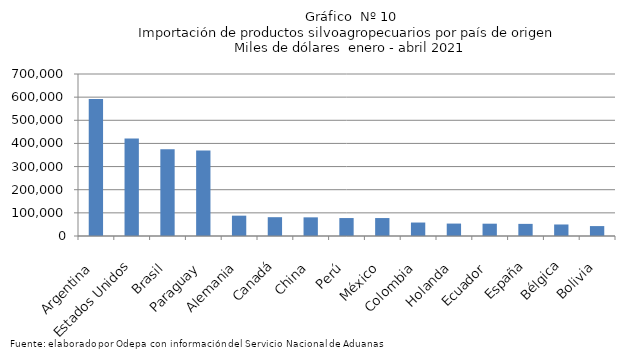
| Category | Series 0 |
|---|---|
| Argentina | 591896.972 |
| Estados Unidos | 421458.597 |
| Brasil | 375229.449 |
| Paraguay | 369307.492 |
| Alemania | 87865.702 |
| Canadá | 81292.94 |
| China | 80602.725 |
| Perú | 77574.089 |
| México | 77573.811 |
| Colombia | 58204.302 |
| Holanda | 53698.04 |
| Ecuador | 53199.094 |
| España | 52380.043 |
| Bélgica | 49754.843 |
| Bolivia | 42847.23 |